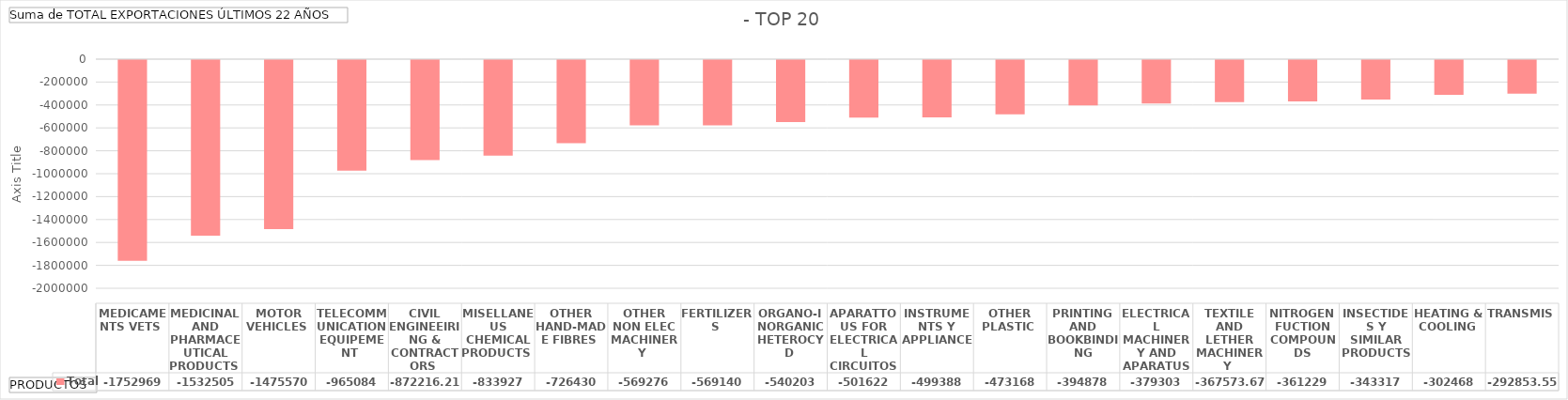
| Category | Total |
|---|---|
| MEDICAMENTS VETS  | -1752969 |
| MEDICINAL AND PHARMACEUTICAL PRODUCTS  | -1532505 |
| MOTOR VEHICLES  | -1475570 |
| TELECOMMUNICATION EQUIPEMENT  | -965084 |
| CIVIL ENGINEEIRING & CONTRACTORS  | -872216.212 |
| MISELLANEUS CHEMICAL PRODUCTS  | -833927 |
| OTHER HAND-MADE FIBRES  | -726430 |
| OTHER NON ELEC MACHINERY  | -569276 |
| FERTILIZERS  | -569140 |
| ORGANO-INORGANIC HETEROCYD  | -540203 |
| APARATTOUS FOR ELECTRICAL CIRCUITOS | -501622 |
| INSTRUMENTS Y APPLIANCE  | -499388 |
| OTHER PLASTIC  | -473168 |
| PRINTING AND BOOKBINDING | -394878 |
| ELECTRICAL MACHINERY AND APARATUS | -379303 |
| TEXTILE AND LETHER MACHINERY  | -367573.67 |
| NITROGEN FUCTION COMPOUNDS | -361229 |
| INSECTIDES Y SIMILAR PRODUCTS | -343317 |
| HEATING & COOLING  | -302468 |
| TRANSMIS, SHAFTS  | -292853.55 |